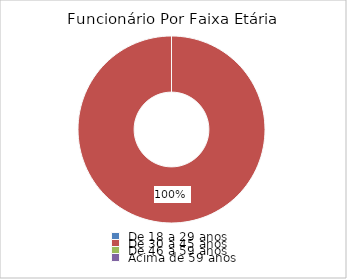
| Category | Total |
|---|---|
| De 18 a 29 anos | 0 |
| De 30 a 45 anos | 1 |
| De 46 a 59 anos | 0 |
| Acima de 59 anos | 0 |